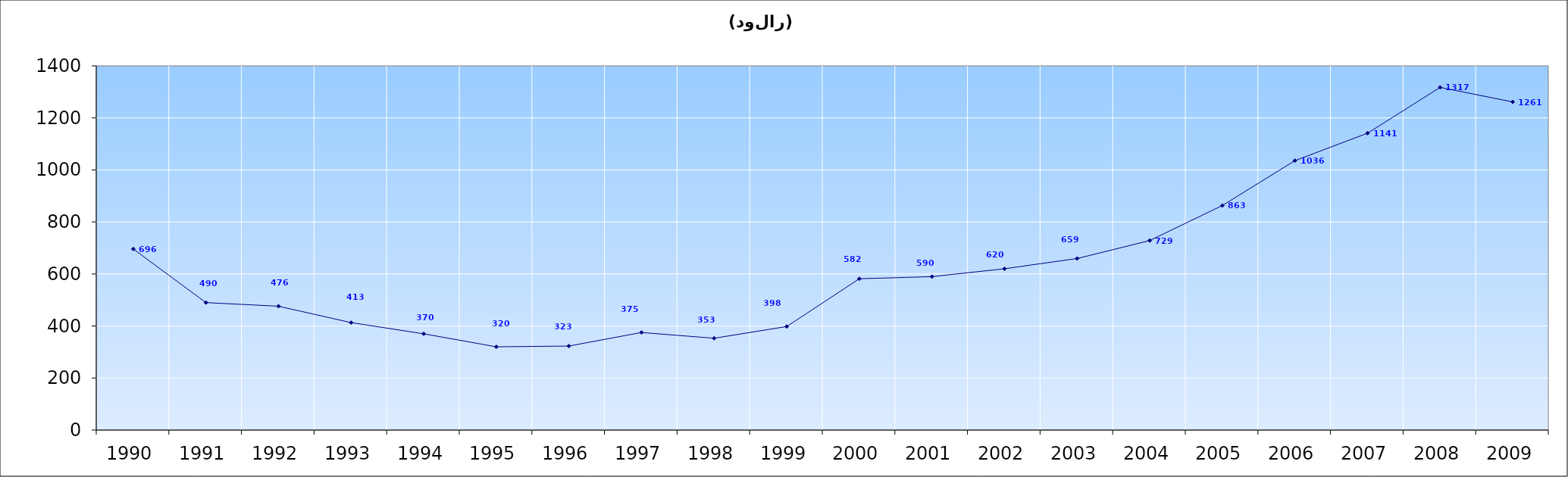
| Category | Series 0 |
|---|---|
| 1990.0 | 696 |
| 1991.0 | 490 |
| 1992.0 | 476 |
| 1993.0 | 413 |
| 1994.0 | 370 |
| 1995.0 | 320 |
| 1996.0 | 323 |
| 1997.0 | 375 |
| 1998.0 | 353 |
| 1999.0 | 398 |
| 2000.0 | 581.665 |
| 2001.0 | 589.796 |
| 2002.0 | 620.077 |
| 2003.0 | 659.42 |
| 2004.0 | 728.557 |
| 2005.0 | 863.088 |
| 2006.0 | 1035.703 |
| 2007.0 | 1141.257 |
| 2008.0 | 1317.348 |
| 2009.0 | 1261.412 |